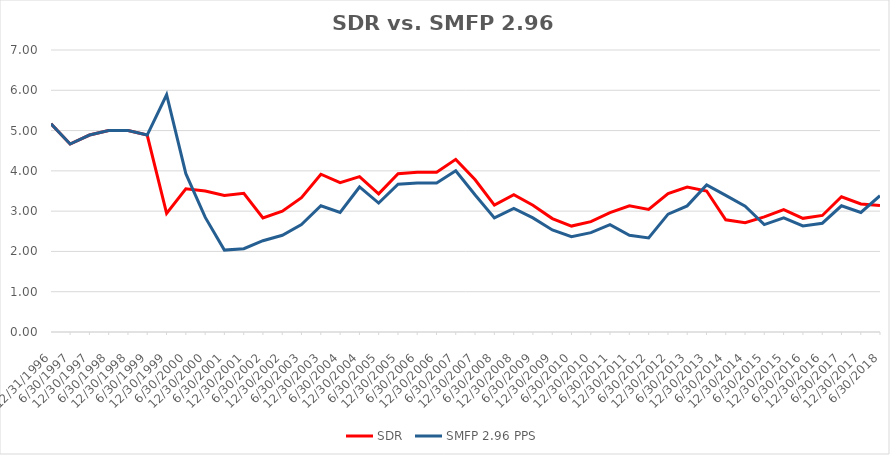
| Category | SDR | SMFP 2.96 PPS |
|---|---|---|
| 12/31/96 | 5.167 | 5.167 |
| 6/30/97 | 4.667 | 4.667 |
| 12/31/97 | 4.889 | 4.889 |
| 6/30/98 | 5 | 5 |
| 12/31/98 | 5 | 5 |
| 6/30/99 | 4.889 | 4.889 |
| 12/31/99 | 2.944 | 5.889 |
| 6/30/00 | 3.556 | 3.929 |
| 12/31/00 | 3.5 | 2.844 |
| 6/30/01 | 3.389 | 2.033 |
| 12/31/01 | 3.444 | 2.067 |
| 6/30/02 | 2.833 | 2.267 |
| 12/31/02 | 3 | 2.4 |
| 6/30/03 | 3.333 | 2.667 |
| 12/31/03 | 3.917 | 3.133 |
| 6/30/04 | 3.708 | 2.967 |
| 12/31/04 | 3.857 | 3.6 |
| 6/30/05 | 3.429 | 3.2 |
| 12/31/05 | 3.929 | 3.667 |
| 6/30/06 | 3.964 | 3.7 |
| 12/31/06 | 3.964 | 3.7 |
| 6/30/07 | 4.286 | 4 |
| 12/31/07 | 3.778 | 3.4 |
| 6/30/08 | 3.148 | 2.833 |
| 12/31/08 | 3.407 | 3.067 |
| 6/30/09 | 3.148 | 2.833 |
| 12/31/09 | 2.815 | 2.533 |
| 6/30/10 | 2.63 | 2.367 |
| 12/31/10 | 2.741 | 2.467 |
| 6/30/11 | 2.963 | 2.667 |
| 12/31/11 | 3.13 | 2.4 |
| 6/30/12 | 3.043 | 2.333 |
| 12/31/12 | 3.435 | 2.926 |
| 6/30/13 | 3.6 | 3.13 |
| 12/31/13 | 3.5 | 3.652 |
| 6/30/14 | 2.786 | 3.391 |
| 12/31/14 | 2.714 | 3.124 |
| 6/30/15 | 2.857 | 2.667 |
| 12/31/15 | 3.036 | 2.833 |
| 6/30/16 | 2.821 | 2.633 |
| 12/31/16 | 2.893 | 2.7 |
| 6/30/17 | 3.357 | 3.133 |
| 12/31/17 | 3.179 | 2.967 |
| 6/30/18 | 3.143 | 3.385 |